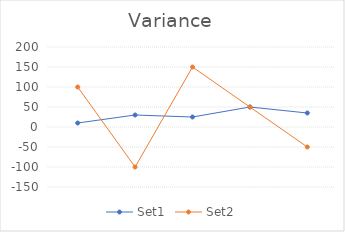
| Category | Set1 | Set2 |
|---|---|---|
| 0 | 10 | 100 |
| 1 | 30 | -100 |
| 2 | 25 | 150 |
| 3 | 50 | 50 |
| 4 | 35 | -50 |